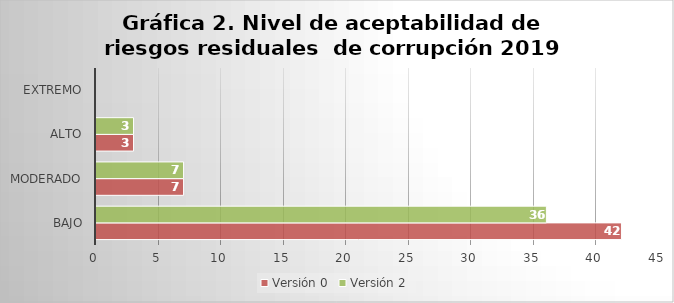
| Category | Versión 0 | Versión 2 |
|---|---|---|
| Bajo | 42 | 36 |
| Moderado | 7 | 7 |
| Alto | 3 | 3 |
| Extremo | 0 | 0 |